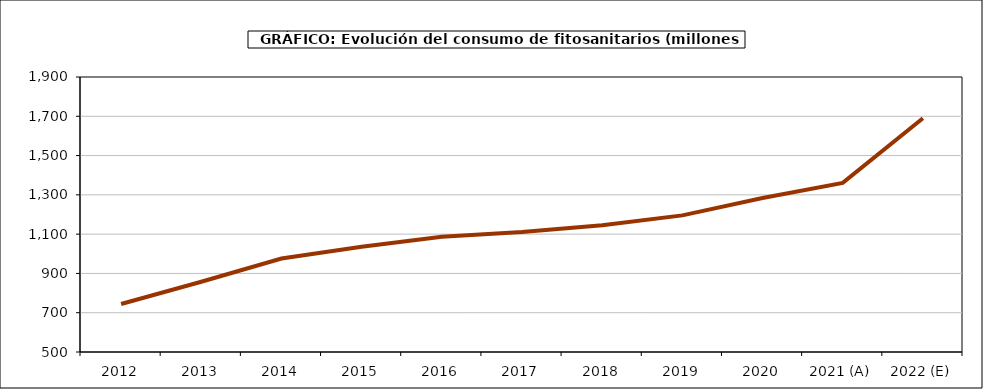
| Category | fitosanitarios |
|---|---|
| 2012 | 744.231 |
| 2013 | 857.443 |
| 2014 | 975.802 |
| 2015 | 1036.274 |
| 2016 | 1086.927 |
| 2017 | 1110.713 |
| 2018 | 1145.257 |
| 2019 | 1195.414 |
| 2020 | 1283.655 |
| 2021 (A) | 1361.047 |
| 2022 (E) | 1690.057 |